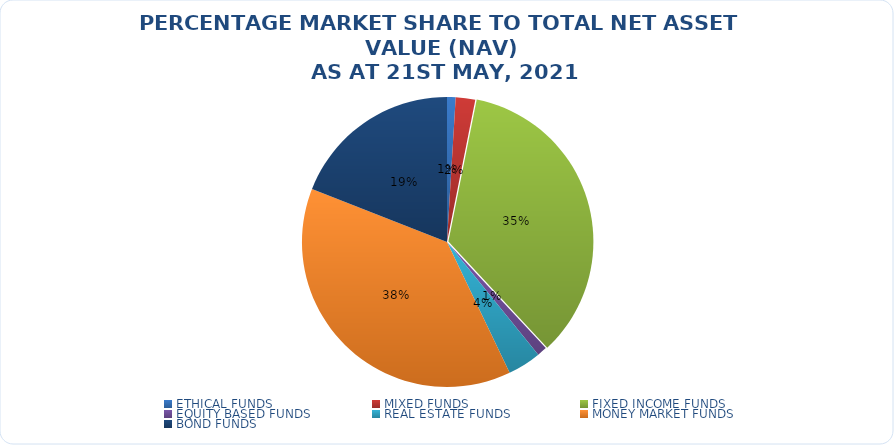
| Category | NET ASSET VALUE |
|---|---|
| ETHICAL FUNDS | 12798029076.03 |
| MIXED FUNDS | 28972789336.45 |
| FIXED INCOME FUNDS | 466270217450.1 |
| EQUITY BASED FUNDS | 14707102914.75 |
| REAL ESTATE FUNDS | 49723645730.911 |
| MONEY MARKET FUNDS | 507903798812.736 |
| BOND FUNDS | 254269172604.1 |